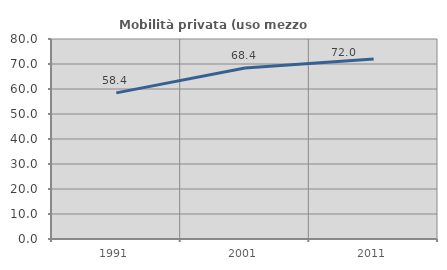
| Category | Mobilità privata (uso mezzo privato) |
|---|---|
| 1991.0 | 58.446 |
| 2001.0 | 68.367 |
| 2011.0 | 71.991 |